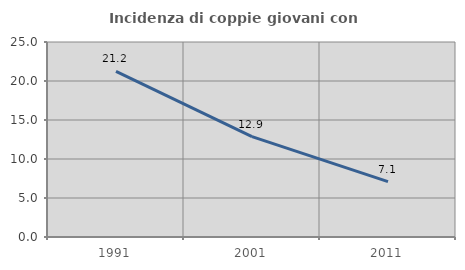
| Category | Incidenza di coppie giovani con figli |
|---|---|
| 1991.0 | 21.246 |
| 2001.0 | 12.872 |
| 2011.0 | 7.102 |